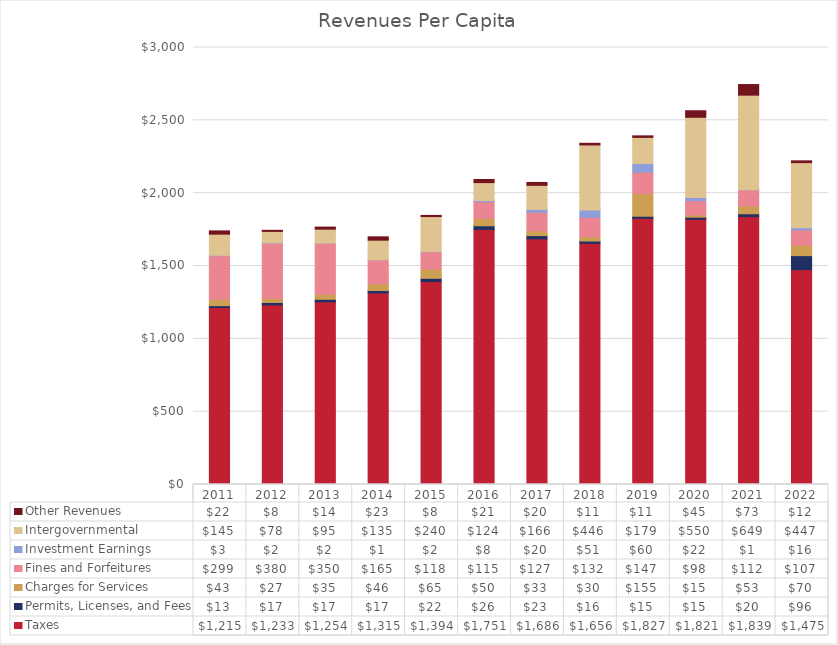
| Category | Taxes | Permits, Licenses, and Fees | Charges for Services | Fines and Forfeitures | Investment Earnings | Intergovernmental | Other Revenues |
|---|---|---|---|---|---|---|---|
| 2011.0 | 1214.919 | 12.896 | 43.302 | 299.459 | 2.656 | 145.302 | 22.428 |
| 2012.0 | 1232.679 | 16.844 | 27.308 | 380.096 | 2.211 | 78.264 | 7.511 |
| 2013.0 | 1254.368 | 16.977 | 34.668 | 349.559 | 1.811 | 95.414 | 14.315 |
| 2014.0 | 1314.948 | 16.64 | 45.951 | 164.517 | 0.638 | 134.619 | 22.916 |
| 2015.0 | 1393.698 | 21.786 | 64.55 | 117.525 | 1.586 | 240.217 | 7.95 |
| 2016.0 | 1750.607 | 25.663 | 50.085 | 114.521 | 7.954 | 123.677 | 21.29 |
| 2017.0 | 1685.959 | 22.816 | 32.692 | 127.085 | 19.553 | 165.719 | 19.753 |
| 2018.0 | 1655.642 | 15.88 | 29.968 | 132.366 | 51.305 | 445.796 | 11.384 |
| 2019.0 | 1827.034 | 14.608 | 155.197 | 147.148 | 59.576 | 179.374 | 10.536 |
| 2020.0 | 1820.597 | 14.512 | 15.334 | 98.448 | 22.096 | 549.904 | 44.812 |
| 2021.0 | 1838.773 | 19.87 | 52.787 | 111.637 | 1.224 | 648.542 | 72.855 |
| 2022.0 | 1474.889 | 96.294 | 69.728 | 106.587 | 15.522 | 446.603 | 12.363 |